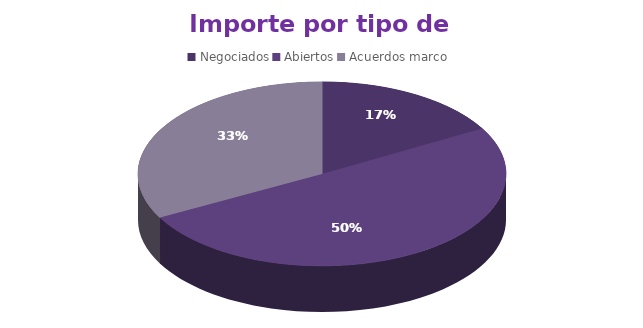
| Category | Series 1 |
|---|---|
| Negociados | 790248 |
| Abiertos | 2370365.6 |
| Acuerdos marco | 1548797.86 |